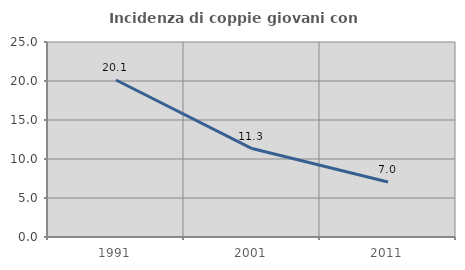
| Category | Incidenza di coppie giovani con figli |
|---|---|
| 1991.0 | 20.132 |
| 2001.0 | 11.339 |
| 2011.0 | 7.042 |